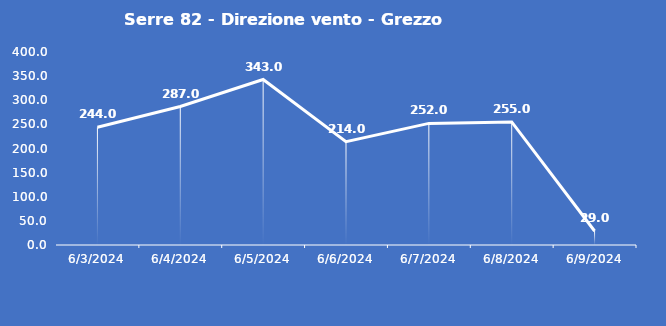
| Category | Serre 82 - Direzione vento - Grezzo (°N) |
|---|---|
| 6/3/24 | 244 |
| 6/4/24 | 287 |
| 6/5/24 | 343 |
| 6/6/24 | 214 |
| 6/7/24 | 252 |
| 6/8/24 | 255 |
| 6/9/24 | 29 |